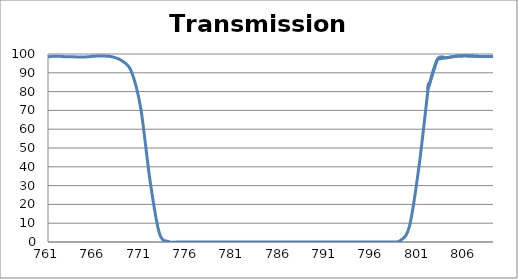
| Category | Transmission (%) |
|---|---|
| 2600.0 | 65.392 |
| 2599.0 | 65.569 |
| 2598.0 | 65.712 |
| 2597.0 | 65.833 |
| 2596.0 | 65.933 |
| 2595.0 | 66.007 |
| 2594.0 | 66.052 |
| 2593.0 | 66.114 |
| 2592.0 | 66.077 |
| 2591.0 | 66.056 |
| 2590.0 | 66.05 |
| 2589.0 | 66.052 |
| 2588.0 | 66.001 |
| 2587.0 | 65.917 |
| 2586.0 | 65.876 |
| 2585.0 | 65.834 |
| 2584.0 | 65.83 |
| 2583.0 | 65.81 |
| 2582.0 | 65.764 |
| 2581.0 | 65.782 |
| 2580.0 | 65.828 |
| 2579.0 | 65.907 |
| 2578.0 | 66.003 |
| 2577.0 | 66.11 |
| 2576.0 | 66.23 |
| 2575.0 | 66.378 |
| 2574.0 | 66.574 |
| 2573.0 | 66.798 |
| 2572.0 | 67.039 |
| 2571.0 | 67.352 |
| 2570.0 | 67.721 |
| 2569.0 | 68.146 |
| 2568.0 | 68.59 |
| 2567.0 | 69.084 |
| 2566.0 | 69.505 |
| 2565.0 | 69.982 |
| 2564.0 | 70.445 |
| 2563.0 | 70.91 |
| 2562.0 | 71.297 |
| 2561.0 | 71.649 |
| 2560.0 | 71.98 |
| 2559.0 | 72.282 |
| 2558.0 | 72.572 |
| 2557.0 | 72.751 |
| 2556.0 | 72.898 |
| 2555.0 | 72.986 |
| 2554.0 | 73.059 |
| 2553.0 | 73.054 |
| 2552.0 | 72.981 |
| 2551.0 | 72.816 |
| 2550.0 | 72.572 |
| 2549.0 | 72.279 |
| 2548.0 | 71.984 |
| 2547.0 | 71.616 |
| 2546.0 | 71.232 |
| 2545.0 | 70.837 |
| 2544.0 | 70.409 |
| 2543.0 | 69.989 |
| 2542.0 | 69.563 |
| 2541.0 | 69.101 |
| 2540.0 | 68.692 |
| 2539.0 | 68.259 |
| 2538.0 | 67.835 |
| 2537.0 | 67.445 |
| 2536.0 | 67.096 |
| 2535.0 | 66.797 |
| 2534.0 | 66.562 |
| 2533.0 | 66.352 |
| 2532.0 | 66.209 |
| 2531.0 | 66.12 |
| 2530.0 | 66.064 |
| 2529.0 | 66.136 |
| 2528.0 | 66.3 |
| 2527.0 | 66.479 |
| 2526.0 | 66.714 |
| 2525.0 | 66.999 |
| 2524.0 | 67.356 |
| 2523.0 | 67.778 |
| 2522.0 | 68.26 |
| 2521.0 | 68.773 |
| 2520.0 | 69.35 |
| 2519.0 | 69.96 |
| 2518.0 | 70.579 |
| 2517.0 | 71.29 |
| 2516.0 | 71.95 |
| 2515.0 | 72.606 |
| 2514.0 | 73.218 |
| 2513.0 | 73.827 |
| 2512.0 | 74.378 |
| 2511.0 | 74.853 |
| 2510.0 | 75.248 |
| 2509.0 | 75.572 |
| 2508.0 | 75.848 |
| 2507.0 | 75.979 |
| 2506.0 | 76.055 |
| 2505.0 | 76.059 |
| 2504.0 | 75.941 |
| 2503.0 | 75.688 |
| 2502.0 | 75.381 |
| 2501.0 | 75.04 |
| 2500.0 | 74.624 |
| 2499.0 | 74.088 |
| 2498.0 | 73.537 |
| 2497.0 | 72.972 |
| 2496.0 | 72.404 |
| 2495.0 | 71.796 |
| 2494.0 | 71.179 |
| 2493.0 | 70.555 |
| 2492.0 | 69.954 |
| 2491.0 | 69.397 |
| 2490.0 | 68.921 |
| 2489.0 | 68.477 |
| 2488.0 | 68.054 |
| 2487.0 | 67.668 |
| 2486.0 | 67.337 |
| 2485.0 | 67.088 |
| 2484.0 | 66.941 |
| 2483.0 | 66.849 |
| 2482.0 | 66.819 |
| 2481.0 | 66.855 |
| 2480.0 | 66.971 |
| 2479.0 | 67.151 |
| 2478.0 | 67.407 |
| 2477.0 | 67.737 |
| 2476.0 | 68.134 |
| 2475.0 | 68.574 |
| 2474.0 | 69.086 |
| 2473.0 | 69.625 |
| 2472.0 | 70.196 |
| 2471.0 | 70.812 |
| 2470.0 | 71.411 |
| 2469.0 | 72.019 |
| 2468.0 | 72.648 |
| 2467.0 | 73.296 |
| 2466.0 | 73.874 |
| 2465.0 | 74.433 |
| 2464.0 | 74.97 |
| 2463.0 | 75.485 |
| 2462.0 | 75.889 |
| 2461.0 | 76.26 |
| 2460.0 | 76.544 |
| 2459.0 | 76.79 |
| 2458.0 | 77.011 |
| 2457.0 | 77.162 |
| 2456.0 | 77.234 |
| 2455.0 | 77.255 |
| 2454.0 | 77.234 |
| 2453.0 | 77.16 |
| 2452.0 | 77.054 |
| 2451.0 | 76.942 |
| 2450.0 | 76.807 |
| 2449.0 | 76.628 |
| 2448.0 | 76.45 |
| 2447.0 | 76.275 |
| 2446.0 | 76.106 |
| 2445.0 | 75.931 |
| 2444.0 | 75.772 |
| 2443.0 | 75.622 |
| 2442.0 | 75.512 |
| 2441.0 | 75.399 |
| 2440.0 | 75.288 |
| 2439.0 | 75.223 |
| 2438.0 | 75.197 |
| 2437.0 | 75.196 |
| 2436.0 | 75.216 |
| 2435.0 | 75.24 |
| 2434.0 | 75.305 |
| 2433.0 | 75.419 |
| 2432.0 | 75.549 |
| 2431.0 | 75.673 |
| 2430.0 | 75.783 |
| 2429.0 | 75.884 |
| 2428.0 | 76.011 |
| 2427.0 | 76.131 |
| 2426.0 | 76.223 |
| 2425.0 | 76.307 |
| 2424.0 | 76.385 |
| 2423.0 | 76.463 |
| 2422.0 | 76.546 |
| 2421.0 | 76.616 |
| 2420.0 | 76.647 |
| 2419.0 | 76.647 |
| 2418.0 | 76.644 |
| 2417.0 | 76.643 |
| 2416.0 | 76.65 |
| 2415.0 | 76.65 |
| 2414.0 | 76.644 |
| 2413.0 | 76.627 |
| 2412.0 | 76.619 |
| 2411.0 | 76.622 |
| 2410.0 | 76.607 |
| 2409.0 | 76.602 |
| 2408.0 | 76.606 |
| 2407.0 | 76.613 |
| 2406.0 | 76.616 |
| 2405.0 | 76.615 |
| 2404.0 | 76.611 |
| 2403.0 | 76.58 |
| 2402.0 | 76.531 |
| 2401.0 | 76.476 |
| 2400.0 | 76.444 |
| 2399.0 | 76.409 |
| 2398.0 | 76.325 |
| 2397.0 | 76.189 |
| 2396.0 | 76.01 |
| 2395.0 | 75.796 |
| 2394.0 | 75.561 |
| 2393.0 | 75.313 |
| 2392.0 | 74.987 |
| 2391.0 | 74.599 |
| 2390.0 | 74.17 |
| 2389.0 | 73.706 |
| 2388.0 | 73.204 |
| 2387.0 | 72.679 |
| 2386.0 | 72.137 |
| 2385.0 | 71.579 |
| 2384.0 | 71.007 |
| 2383.0 | 70.424 |
| 2382.0 | 69.843 |
| 2381.0 | 69.275 |
| 2380.0 | 68.702 |
| 2379.0 | 68.167 |
| 2378.0 | 67.665 |
| 2377.0 | 67.224 |
| 2376.0 | 66.84 |
| 2375.0 | 66.502 |
| 2374.0 | 66.164 |
| 2373.0 | 65.874 |
| 2372.0 | 65.662 |
| 2371.0 | 65.535 |
| 2370.0 | 65.459 |
| 2369.0 | 65.438 |
| 2368.0 | 65.477 |
| 2367.0 | 65.561 |
| 2366.0 | 65.687 |
| 2365.0 | 65.869 |
| 2364.0 | 66.115 |
| 2363.0 | 66.384 |
| 2362.0 | 66.668 |
| 2361.0 | 66.985 |
| 2360.0 | 67.341 |
| 2359.0 | 67.702 |
| 2358.0 | 68.036 |
| 2357.0 | 68.313 |
| 2356.0 | 68.567 |
| 2355.0 | 68.815 |
| 2354.0 | 69.021 |
| 2353.0 | 69.188 |
| 2352.0 | 69.291 |
| 2351.0 | 69.297 |
| 2350.0 | 69.217 |
| 2349.0 | 69.112 |
| 2348.0 | 68.929 |
| 2347.0 | 68.699 |
| 2346.0 | 68.378 |
| 2345.0 | 68.01 |
| 2344.0 | 67.616 |
| 2343.0 | 67.184 |
| 2342.0 | 66.73 |
| 2341.0 | 66.258 |
| 2340.0 | 65.758 |
| 2339.0 | 65.282 |
| 2338.0 | 64.845 |
| 2337.0 | 64.443 |
| 2336.0 | 64.053 |
| 2335.0 | 63.687 |
| 2334.0 | 63.375 |
| 2333.0 | 63.109 |
| 2332.0 | 62.893 |
| 2331.0 | 62.749 |
| 2330.0 | 62.664 |
| 2329.0 | 62.631 |
| 2328.0 | 62.658 |
| 2327.0 | 62.703 |
| 2326.0 | 62.792 |
| 2325.0 | 62.936 |
| 2324.0 | 63.129 |
| 2323.0 | 63.364 |
| 2322.0 | 63.613 |
| 2321.0 | 63.92 |
| 2320.0 | 64.245 |
| 2319.0 | 64.555 |
| 2318.0 | 64.844 |
| 2317.0 | 65.141 |
| 2316.0 | 65.392 |
| 2315.0 | 65.642 |
| 2314.0 | 65.861 |
| 2313.0 | 66.066 |
| 2312.0 | 66.227 |
| 2311.0 | 66.312 |
| 2310.0 | 66.341 |
| 2309.0 | 66.341 |
| 2308.0 | 66.301 |
| 2307.0 | 66.231 |
| 2306.0 | 66.153 |
| 2305.0 | 66.035 |
| 2304.0 | 65.872 |
| 2303.0 | 65.712 |
| 2302.0 | 65.555 |
| 2301.0 | 65.421 |
| 2300.0 | 65.268 |
| 2299.0 | 65.144 |
| 2298.0 | 65.053 |
| 2297.0 | 64.975 |
| 2296.0 | 64.936 |
| 2295.0 | 64.87 |
| 2294.0 | 64.835 |
| 2293.0 | 64.83 |
| 2292.0 | 64.857 |
| 2291.0 | 64.901 |
| 2290.0 | 64.963 |
| 2289.0 | 65.046 |
| 2288.0 | 65.121 |
| 2287.0 | 65.16 |
| 2286.0 | 65.197 |
| 2285.0 | 65.22 |
| 2284.0 | 65.219 |
| 2283.0 | 65.169 |
| 2282.0 | 65.091 |
| 2281.0 | 64.98 |
| 2280.0 | 64.812 |
| 2279.0 | 64.631 |
| 2278.0 | 64.383 |
| 2277.0 | 64.058 |
| 2276.0 | 63.702 |
| 2275.0 | 63.325 |
| 2274.0 | 62.902 |
| 2273.0 | 62.465 |
| 2272.0 | 62.015 |
| 2271.0 | 61.587 |
| 2270.0 | 61.133 |
| 2269.0 | 60.74 |
| 2268.0 | 60.393 |
| 2267.0 | 60.045 |
| 2266.0 | 59.742 |
| 2265.0 | 59.493 |
| 2264.0 | 59.269 |
| 2263.0 | 59.108 |
| 2262.0 | 59.016 |
| 2261.0 | 58.966 |
| 2260.0 | 58.954 |
| 2259.0 | 58.952 |
| 2258.0 | 59.022 |
| 2257.0 | 59.155 |
| 2256.0 | 59.275 |
| 2255.0 | 59.371 |
| 2254.0 | 59.445 |
| 2253.0 | 59.472 |
| 2252.0 | 59.451 |
| 2251.0 | 59.435 |
| 2250.0 | 59.334 |
| 2249.0 | 59.173 |
| 2248.0 | 58.926 |
| 2247.0 | 58.584 |
| 2246.0 | 58.147 |
| 2245.0 | 57.635 |
| 2244.0 | 57.051 |
| 2243.0 | 56.355 |
| 2242.0 | 55.578 |
| 2241.0 | 54.774 |
| 2240.0 | 53.89 |
| 2239.0 | 53.035 |
| 2238.0 | 52.113 |
| 2237.0 | 51.259 |
| 2236.0 | 50.404 |
| 2235.0 | 49.577 |
| 2234.0 | 48.798 |
| 2233.0 | 48.076 |
| 2232.0 | 47.42 |
| 2231.0 | 46.856 |
| 2230.0 | 46.356 |
| 2229.0 | 45.979 |
| 2228.0 | 45.703 |
| 2227.0 | 45.499 |
| 2226.0 | 45.386 |
| 2225.0 | 45.328 |
| 2224.0 | 45.396 |
| 2223.0 | 45.529 |
| 2222.0 | 45.768 |
| 2221.0 | 46.08 |
| 2220.0 | 46.447 |
| 2219.0 | 46.852 |
| 2218.0 | 47.315 |
| 2217.0 | 47.786 |
| 2216.0 | 48.29 |
| 2215.0 | 48.755 |
| 2214.0 | 49.233 |
| 2213.0 | 49.713 |
| 2212.0 | 50.107 |
| 2211.0 | 50.447 |
| 2210.0 | 50.719 |
| 2209.0 | 50.936 |
| 2208.0 | 51.076 |
| 2207.0 | 51.149 |
| 2206.0 | 51.204 |
| 2205.0 | 51.189 |
| 2204.0 | 51.124 |
| 2203.0 | 50.978 |
| 2202.0 | 50.783 |
| 2201.0 | 50.603 |
| 2200.0 | 50.431 |
| 2199.0 | 50.266 |
| 2198.0 | 50.106 |
| 2197.0 | 49.983 |
| 2196.0 | 49.88 |
| 2195.0 | 49.856 |
| 2194.0 | 49.85 |
| 2193.0 | 49.902 |
| 2192.0 | 49.999 |
| 2191.0 | 50.164 |
| 2190.0 | 50.431 |
| 2189.0 | 50.716 |
| 2188.0 | 51.083 |
| 2187.0 | 51.518 |
| 2186.0 | 51.992 |
| 2185.0 | 52.482 |
| 2184.0 | 53.045 |
| 2183.0 | 53.653 |
| 2182.0 | 54.217 |
| 2181.0 | 54.83 |
| 2180.0 | 55.368 |
| 2179.0 | 55.875 |
| 2178.0 | 56.347 |
| 2177.0 | 56.821 |
| 2176.0 | 57.155 |
| 2175.0 | 57.429 |
| 2174.0 | 57.618 |
| 2173.0 | 57.769 |
| 2172.0 | 57.888 |
| 2171.0 | 57.874 |
| 2170.0 | 57.807 |
| 2169.0 | 57.692 |
| 2168.0 | 57.545 |
| 2167.0 | 57.423 |
| 2166.0 | 57.256 |
| 2165.0 | 57.059 |
| 2164.0 | 56.901 |
| 2163.0 | 56.741 |
| 2162.0 | 56.638 |
| 2161.0 | 56.617 |
| 2160.0 | 56.62 |
| 2159.0 | 56.644 |
| 2158.0 | 56.736 |
| 2157.0 | 56.884 |
| 2156.0 | 57.14 |
| 2155.0 | 57.394 |
| 2154.0 | 57.67 |
| 2153.0 | 57.951 |
| 2152.0 | 58.289 |
| 2151.0 | 58.65 |
| 2150.0 | 58.939 |
| 2149.0 | 59.199 |
| 2148.0 | 59.406 |
| 2147.0 | 59.558 |
| 2146.0 | 59.686 |
| 2145.0 | 59.691 |
| 2144.0 | 59.682 |
| 2143.0 | 59.561 |
| 2142.0 | 59.381 |
| 2141.0 | 59.184 |
| 2140.0 | 58.93 |
| 2139.0 | 58.604 |
| 2138.0 | 58.248 |
| 2137.0 | 57.942 |
| 2136.0 | 57.637 |
| 2135.0 | 57.33 |
| 2134.0 | 57.076 |
| 2133.0 | 56.878 |
| 2132.0 | 56.725 |
| 2131.0 | 56.59 |
| 2130.0 | 56.507 |
| 2129.0 | 56.526 |
| 2128.0 | 56.609 |
| 2127.0 | 56.734 |
| 2126.0 | 56.876 |
| 2125.0 | 57.061 |
| 2124.0 | 57.294 |
| 2123.0 | 57.535 |
| 2122.0 | 57.726 |
| 2121.0 | 57.886 |
| 2120.0 | 58.003 |
| 2119.0 | 58.038 |
| 2118.0 | 57.981 |
| 2117.0 | 57.804 |
| 2116.0 | 57.503 |
| 2115.0 | 57.111 |
| 2114.0 | 56.593 |
| 2113.0 | 55.988 |
| 2112.0 | 55.234 |
| 2111.0 | 54.438 |
| 2110.0 | 53.562 |
| 2109.0 | 52.667 |
| 2108.0 | 51.734 |
| 2107.0 | 50.841 |
| 2106.0 | 49.953 |
| 2105.0 | 49.168 |
| 2104.0 | 48.407 |
| 2103.0 | 47.741 |
| 2102.0 | 47.183 |
| 2101.0 | 46.738 |
| 2100.0 | 46.382 |
| 2099.0 | 46.129 |
| 2098.0 | 45.999 |
| 2097.0 | 45.979 |
| 2096.0 | 46.036 |
| 2095.0 | 46.167 |
| 2094.0 | 46.39 |
| 2093.0 | 46.671 |
| 2092.0 | 47.017 |
| 2091.0 | 47.417 |
| 2090.0 | 47.808 |
| 2089.0 | 48.195 |
| 2088.0 | 48.561 |
| 2087.0 | 48.913 |
| 2086.0 | 49.168 |
| 2085.0 | 49.332 |
| 2084.0 | 49.405 |
| 2083.0 | 49.385 |
| 2082.0 | 49.257 |
| 2081.0 | 49.034 |
| 2080.0 | 48.679 |
| 2079.0 | 48.213 |
| 2078.0 | 47.654 |
| 2077.0 | 47.046 |
| 2076.0 | 46.442 |
| 2075.0 | 45.805 |
| 2074.0 | 45.115 |
| 2073.0 | 44.457 |
| 2072.0 | 43.848 |
| 2071.0 | 43.308 |
| 2070.0 | 42.828 |
| 2069.0 | 42.4 |
| 2068.0 | 42.047 |
| 2067.0 | 41.775 |
| 2066.0 | 41.597 |
| 2065.0 | 41.481 |
| 2064.0 | 41.404 |
| 2063.0 | 41.387 |
| 2062.0 | 41.444 |
| 2061.0 | 41.556 |
| 2060.0 | 41.667 |
| 2059.0 | 41.789 |
| 2058.0 | 41.915 |
| 2057.0 | 42.056 |
| 2056.0 | 42.206 |
| 2055.0 | 42.303 |
| 2054.0 | 42.35 |
| 2053.0 | 42.37 |
| 2052.0 | 42.362 |
| 2051.0 | 42.343 |
| 2050.0 | 42.303 |
| 2049.0 | 42.216 |
| 2048.0 | 42.107 |
| 2047.0 | 42.011 |
| 2046.0 | 41.938 |
| 2045.0 | 41.856 |
| 2044.0 | 41.787 |
| 2043.0 | 41.754 |
| 2042.0 | 41.794 |
| 2041.0 | 41.888 |
| 2040.0 | 42.018 |
| 2039.0 | 42.209 |
| 2038.0 | 42.465 |
| 2037.0 | 42.816 |
| 2036.0 | 43.213 |
| 2035.0 | 43.634 |
| 2034.0 | 44.086 |
| 2033.0 | 44.561 |
| 2032.0 | 45.092 |
| 2031.0 | 45.608 |
| 2030.0 | 46.072 |
| 2029.0 | 46.509 |
| 2028.0 | 46.88 |
| 2027.0 | 47.142 |
| 2026.0 | 47.312 |
| 2025.0 | 47.403 |
| 2024.0 | 47.418 |
| 2023.0 | 47.343 |
| 2022.0 | 47.169 |
| 2021.0 | 46.926 |
| 2020.0 | 46.644 |
| 2019.0 | 46.35 |
| 2018.0 | 46.05 |
| 2017.0 | 45.751 |
| 2016.0 | 45.477 |
| 2015.0 | 45.267 |
| 2014.0 | 45.143 |
| 2013.0 | 45.07 |
| 2012.0 | 45.057 |
| 2011.0 | 45.161 |
| 2010.0 | 45.36 |
| 2009.0 | 45.627 |
| 2008.0 | 45.971 |
| 2007.0 | 46.398 |
| 2006.0 | 46.908 |
| 2005.0 | 47.502 |
| 2004.0 | 48.126 |
| 2003.0 | 48.756 |
| 2002.0 | 49.373 |
| 2001.0 | 49.956 |
| 2000.0 | 50.493 |
| 1999.0 | 50.958 |
| 1998.0 | 51.348 |
| 1997.0 | 51.611 |
| 1996.0 | 51.704 |
| 1995.0 | 51.689 |
| 1994.0 | 51.563 |
| 1993.0 | 51.325 |
| 1992.0 | 51.027 |
| 1991.0 | 50.681 |
| 1990.0 | 50.28 |
| 1989.0 | 49.865 |
| 1988.0 | 49.491 |
| 1987.0 | 49.151 |
| 1986.0 | 48.878 |
| 1985.0 | 48.69 |
| 1984.0 | 48.59 |
| 1983.0 | 48.575 |
| 1982.0 | 48.665 |
| 1981.0 | 48.863 |
| 1980.0 | 49.138 |
| 1979.0 | 49.478 |
| 1978.0 | 49.879 |
| 1977.0 | 50.319 |
| 1976.0 | 50.777 |
| 1975.0 | 51.241 |
| 1974.0 | 51.651 |
| 1973.0 | 52.009 |
| 1972.0 | 52.297 |
| 1971.0 | 52.479 |
| 1970.0 | 52.549 |
| 1969.0 | 52.524 |
| 1968.0 | 52.401 |
| 1967.0 | 52.131 |
| 1966.0 | 51.786 |
| 1965.0 | 51.393 |
| 1964.0 | 50.915 |
| 1963.0 | 50.426 |
| 1962.0 | 49.946 |
| 1961.0 | 49.439 |
| 1960.0 | 49.002 |
| 1959.0 | 48.641 |
| 1958.0 | 48.327 |
| 1957.0 | 48.072 |
| 1956.0 | 47.949 |
| 1955.0 | 47.919 |
| 1954.0 | 47.967 |
| 1953.0 | 48.069 |
| 1952.0 | 48.215 |
| 1951.0 | 48.44 |
| 1950.0 | 48.717 |
| 1949.0 | 49.013 |
| 1948.0 | 49.288 |
| 1947.0 | 49.483 |
| 1946.0 | 49.63 |
| 1945.0 | 49.702 |
| 1944.0 | 49.716 |
| 1943.0 | 49.674 |
| 1942.0 | 49.539 |
| 1941.0 | 49.295 |
| 1940.0 | 48.973 |
| 1939.0 | 48.599 |
| 1938.0 | 48.197 |
| 1937.0 | 47.804 |
| 1936.0 | 47.465 |
| 1935.0 | 47.104 |
| 1934.0 | 46.808 |
| 1933.0 | 46.572 |
| 1932.0 | 46.392 |
| 1931.0 | 46.303 |
| 1930.0 | 46.276 |
| 1929.0 | 46.337 |
| 1928.0 | 46.477 |
| 1927.0 | 46.686 |
| 1926.0 | 46.993 |
| 1925.0 | 47.381 |
| 1924.0 | 47.795 |
| 1923.0 | 48.266 |
| 1922.0 | 48.752 |
| 1921.0 | 49.211 |
| 1920.0 | 49.618 |
| 1919.0 | 49.984 |
| 1918.0 | 50.363 |
| 1917.0 | 50.702 |
| 1916.0 | 50.992 |
| 1915.0 | 51.16 |
| 1914.0 | 51.274 |
| 1913.0 | 51.291 |
| 1912.0 | 51.288 |
| 1911.0 | 51.223 |
| 1910.0 | 51.207 |
| 1909.0 | 51.257 |
| 1908.0 | 51.348 |
| 1907.0 | 51.427 |
| 1906.0 | 51.443 |
| 1905.0 | 51.495 |
| 1904.0 | 51.609 |
| 1903.0 | 51.796 |
| 1902.0 | 52.056 |
| 1901.0 | 52.348 |
| 1900.0 | 52.662 |
| 1899.0 | 52.96 |
| 1898.0 | 53.188 |
| 1897.0 | 53.477 |
| 1896.0 | 53.708 |
| 1895.0 | 53.908 |
| 1894.0 | 54.059 |
| 1893.0 | 54.178 |
| 1892.0 | 54.149 |
| 1891.0 | 54.033 |
| 1890.0 | 53.932 |
| 1889.0 | 53.794 |
| 1888.0 | 53.716 |
| 1887.0 | 53.661 |
| 1886.0 | 53.568 |
| 1885.0 | 53.449 |
| 1884.0 | 53.37 |
| 1883.0 | 53.36 |
| 1882.0 | 53.325 |
| 1881.0 | 53.362 |
| 1880.0 | 53.483 |
| 1879.0 | 53.666 |
| 1878.0 | 53.864 |
| 1877.0 | 54.047 |
| 1876.0 | 54.176 |
| 1875.0 | 54.271 |
| 1874.0 | 54.36 |
| 1873.0 | 54.333 |
| 1872.0 | 54.259 |
| 1871.0 | 54.116 |
| 1870.0 | 53.955 |
| 1869.0 | 53.635 |
| 1868.0 | 53.331 |
| 1867.0 | 53.051 |
| 1866.0 | 52.75 |
| 1865.0 | 52.447 |
| 1864.0 | 52.186 |
| 1863.0 | 51.946 |
| 1862.0 | 51.728 |
| 1861.0 | 51.508 |
| 1860.0 | 51.239 |
| 1859.0 | 51.073 |
| 1858.0 | 51.042 |
| 1857.0 | 51.123 |
| 1856.0 | 51.304 |
| 1855.0 | 51.524 |
| 1854.0 | 51.765 |
| 1853.0 | 51.942 |
| 1852.0 | 52.169 |
| 1851.0 | 52.398 |
| 1850.0 | 52.683 |
| 1849.0 | 52.849 |
| 1848.0 | 52.923 |
| 1847.0 | 52.741 |
| 1846.0 | 52.537 |
| 1845.0 | 52.405 |
| 1844.0 | 52.354 |
| 1843.0 | 52.298 |
| 1842.0 | 52.101 |
| 1841.0 | 51.688 |
| 1840.0 | 51.252 |
| 1839.0 | 50.874 |
| 1838.0 | 50.665 |
| 1837.0 | 50.575 |
| 1836.0 | 50.537 |
| 1835.0 | 50.561 |
| 1834.0 | 50.714 |
| 1833.0 | 50.99 |
| 1832.0 | 51.365 |
| 1831.0 | 51.829 |
| 1830.0 | 52.272 |
| 1829.0 | 52.716 |
| 1828.0 | 53.228 |
| 1827.0 | 53.833 |
| 1826.0 | 54.394 |
| 1825.0 | 54.982 |
| 1824.0 | 55.434 |
| 1823.0 | 55.891 |
| 1822.0 | 56.237 |
| 1821.0 | 56.553 |
| 1820.0 | 56.712 |
| 1819.0 | 56.834 |
| 1818.0 | 56.906 |
| 1817.0 | 57.101 |
| 1816.0 | 57.234 |
| 1815.0 | 57.312 |
| 1814.0 | 57.339 |
| 1813.0 | 57.37 |
| 1812.0 | 57.407 |
| 1811.0 | 57.443 |
| 1810.0 | 57.498 |
| 1809.0 | 57.573 |
| 1808.0 | 57.657 |
| 1807.0 | 57.758 |
| 1806.0 | 57.813 |
| 1805.0 | 57.841 |
| 1804.0 | 57.823 |
| 1803.0 | 57.809 |
| 1802.0 | 57.759 |
| 1801.0 | 57.762 |
| 1800.0 | 57.725 |
| 1799.0 | 57.668 |
| 1798.0 | 57.592 |
| 1797.0 | 57.602 |
| 1796.0 | 57.661 |
| 1795.0 | 57.737 |
| 1794.0 | 57.802 |
| 1793.0 | 57.927 |
| 1792.0 | 58.074 |
| 1791.0 | 58.223 |
| 1790.0 | 58.396 |
| 1789.0 | 58.536 |
| 1788.0 | 58.646 |
| 1787.0 | 58.727 |
| 1786.0 | 58.729 |
| 1785.0 | 58.601 |
| 1784.0 | 58.422 |
| 1783.0 | 58.16 |
| 1782.0 | 57.835 |
| 1781.0 | 57.436 |
| 1780.0 | 56.981 |
| 1779.0 | 56.52 |
| 1778.0 | 56.041 |
| 1777.0 | 55.661 |
| 1776.0 | 55.321 |
| 1775.0 | 55.029 |
| 1774.0 | 54.838 |
| 1773.0 | 54.724 |
| 1772.0 | 54.696 |
| 1771.0 | 54.752 |
| 1770.0 | 54.885 |
| 1769.0 | 55.056 |
| 1768.0 | 55.274 |
| 1767.0 | 55.485 |
| 1766.0 | 55.667 |
| 1765.0 | 55.775 |
| 1764.0 | 55.819 |
| 1763.0 | 55.75 |
| 1762.0 | 55.552 |
| 1761.0 | 55.254 |
| 1760.0 | 54.848 |
| 1759.0 | 54.372 |
| 1758.0 | 53.871 |
| 1757.0 | 53.321 |
| 1756.0 | 52.809 |
| 1755.0 | 52.319 |
| 1754.0 | 51.928 |
| 1753.0 | 51.65 |
| 1752.0 | 51.498 |
| 1751.0 | 51.479 |
| 1750.0 | 51.577 |
| 1749.0 | 51.813 |
| 1748.0 | 52.139 |
| 1747.0 | 52.582 |
| 1746.0 | 53.041 |
| 1745.0 | 53.533 |
| 1744.0 | 54.012 |
| 1743.0 | 54.452 |
| 1742.0 | 54.779 |
| 1741.0 | 55.031 |
| 1740.0 | 55.184 |
| 1739.0 | 55.248 |
| 1738.0 | 55.231 |
| 1737.0 | 55.183 |
| 1736.0 | 55.09 |
| 1735.0 | 55.034 |
| 1734.0 | 55.037 |
| 1733.0 | 55.107 |
| 1732.0 | 55.257 |
| 1731.0 | 55.516 |
| 1730.0 | 55.913 |
| 1729.0 | 56.437 |
| 1728.0 | 57.062 |
| 1727.0 | 57.797 |
| 1726.0 | 58.533 |
| 1725.0 | 59.296 |
| 1724.0 | 60.021 |
| 1723.0 | 60.7 |
| 1722.0 | 61.285 |
| 1721.0 | 61.718 |
| 1720.0 | 62.013 |
| 1719.0 | 62.18 |
| 1718.0 | 62.234 |
| 1717.0 | 62.225 |
| 1716.0 | 62.194 |
| 1715.0 | 62.178 |
| 1714.0 | 62.224 |
| 1713.0 | 62.408 |
| 1712.0 | 62.738 |
| 1711.0 | 63.189 |
| 1710.0 | 63.742 |
| 1709.0 | 64.393 |
| 1708.0 | 65.063 |
| 1707.0 | 65.718 |
| 1706.0 | 66.238 |
| 1705.0 | 66.58 |
| 1704.0 | 66.623 |
| 1703.0 | 66.351 |
| 1702.0 | 65.774 |
| 1701.0 | 64.908 |
| 1700.0 | 63.832 |
| 1699.0 | 62.592 |
| 1698.0 | 61.334 |
| 1697.0 | 60.065 |
| 1696.0 | 58.924 |
| 1695.0 | 57.982 |
| 1694.0 | 57.323 |
| 1693.0 | 56.963 |
| 1692.0 | 56.915 |
| 1691.0 | 57.177 |
| 1690.0 | 57.781 |
| 1689.0 | 58.682 |
| 1688.0 | 59.781 |
| 1687.0 | 61.005 |
| 1686.0 | 62.217 |
| 1685.0 | 63.331 |
| 1684.0 | 64.171 |
| 1683.0 | 64.63 |
| 1682.0 | 64.574 |
| 1681.0 | 63.98 |
| 1680.0 | 62.863 |
| 1679.0 | 61.287 |
| 1678.0 | 59.511 |
| 1677.0 | 57.648 |
| 1676.0 | 55.743 |
| 1675.0 | 53.985 |
| 1674.0 | 52.518 |
| 1673.0 | 51.375 |
| 1672.0 | 50.646 |
| 1671.0 | 50.289 |
| 1670.0 | 50.331 |
| 1669.0 | 50.728 |
| 1668.0 | 51.454 |
| 1667.0 | 52.437 |
| 1666.0 | 53.598 |
| 1665.0 | 54.861 |
| 1664.0 | 56.095 |
| 1663.0 | 57.203 |
| 1662.0 | 58.082 |
| 1661.0 | 58.699 |
| 1660.0 | 58.99 |
| 1659.0 | 58.961 |
| 1658.0 | 58.707 |
| 1657.0 | 58.308 |
| 1656.0 | 57.863 |
| 1655.0 | 57.49 |
| 1654.0 | 57.253 |
| 1653.0 | 57.225 |
| 1652.0 | 57.489 |
| 1651.0 | 58.115 |
| 1650.0 | 59.06 |
| 1649.0 | 60.26 |
| 1648.0 | 61.762 |
| 1647.0 | 63.509 |
| 1646.0 | 65.419 |
| 1645.0 | 67.4 |
| 1644.0 | 69.246 |
| 1643.0 | 70.868 |
| 1642.0 | 72.242 |
| 1641.0 | 73.217 |
| 1640.0 | 73.768 |
| 1639.0 | 73.999 |
| 1638.0 | 73.942 |
| 1637.0 | 73.727 |
| 1636.0 | 73.487 |
| 1635.0 | 73.337 |
| 1634.0 | 73.325 |
| 1633.0 | 73.475 |
| 1632.0 | 73.773 |
| 1631.0 | 74.176 |
| 1630.0 | 74.619 |
| 1629.0 | 74.966 |
| 1628.0 | 75.109 |
| 1627.0 | 74.948 |
| 1626.0 | 74.353 |
| 1625.0 | 73.293 |
| 1624.0 | 71.809 |
| 1623.0 | 69.972 |
| 1622.0 | 67.885 |
| 1621.0 | 65.711 |
| 1620.0 | 63.516 |
| 1619.0 | 61.347 |
| 1618.0 | 59.422 |
| 1617.0 | 57.732 |
| 1616.0 | 56.216 |
| 1615.0 | 54.897 |
| 1614.0 | 53.719 |
| 1613.0 | 52.701 |
| 1612.0 | 51.832 |
| 1611.0 | 51.054 |
| 1610.0 | 50.336 |
| 1609.0 | 49.664 |
| 1608.0 | 49.035 |
| 1607.0 | 48.475 |
| 1606.0 | 48.01 |
| 1605.0 | 47.678 |
| 1604.0 | 47.487 |
| 1603.0 | 47.457 |
| 1602.0 | 47.633 |
| 1601.0 | 48.011 |
| 1600.0 | 48.595 |
| 1599.0 | 49.347 |
| 1598.0 | 50.164 |
| 1597.0 | 50.93 |
| 1596.0 | 51.568 |
| 1595.0 | 51.928 |
| 1594.0 | 51.871 |
| 1593.0 | 51.364 |
| 1592.0 | 50.374 |
| 1591.0 | 49.029 |
| 1590.0 | 47.407 |
| 1589.0 | 45.714 |
| 1588.0 | 44.098 |
| 1587.0 | 42.684 |
| 1586.0 | 41.585 |
| 1585.0 | 40.896 |
| 1584.0 | 40.68 |
| 1583.0 | 40.961 |
| 1582.0 | 41.872 |
| 1581.0 | 43.265 |
| 1580.0 | 45.173 |
| 1579.0 | 47.534 |
| 1578.0 | 50.294 |
| 1577.0 | 53.21 |
| 1576.0 | 56.087 |
| 1575.0 | 58.504 |
| 1574.0 | 60.369 |
| 1573.0 | 61.286 |
| 1572.0 | 61.251 |
| 1571.0 | 60.442 |
| 1570.0 | 59.074 |
| 1569.0 | 57.429 |
| 1568.0 | 55.751 |
| 1567.0 | 54.486 |
| 1566.0 | 53.73 |
| 1565.0 | 53.609 |
| 1564.0 | 54.255 |
| 1563.0 | 55.741 |
| 1562.0 | 58.109 |
| 1561.0 | 61.225 |
| 1560.0 | 65.104 |
| 1559.0 | 69.454 |
| 1558.0 | 73.83 |
| 1557.0 | 77.761 |
| 1556.0 | 80.807 |
| 1555.0 | 82.421 |
| 1554.0 | 82.668 |
| 1553.0 | 81.852 |
| 1552.0 | 80.251 |
| 1551.0 | 78.454 |
| 1550.0 | 76.885 |
| 1549.0 | 75.963 |
| 1548.0 | 75.884 |
| 1547.0 | 76.623 |
| 1546.0 | 78.213 |
| 1545.0 | 80.428 |
| 1544.0 | 82.974 |
| 1543.0 | 85.308 |
| 1542.0 | 86.929 |
| 1541.0 | 87.444 |
| 1540.0 | 86.595 |
| 1539.0 | 84.428 |
| 1538.0 | 81.207 |
| 1537.0 | 77.707 |
| 1536.0 | 74.079 |
| 1535.0 | 70.866 |
| 1534.0 | 68.287 |
| 1533.0 | 66.563 |
| 1532.0 | 65.8 |
| 1531.0 | 66.022 |
| 1530.0 | 67.155 |
| 1529.0 | 68.866 |
| 1528.0 | 71.083 |
| 1527.0 | 73.302 |
| 1526.0 | 75.107 |
| 1525.0 | 75.979 |
| 1524.0 | 75.575 |
| 1523.0 | 73.838 |
| 1522.0 | 70.794 |
| 1521.0 | 67.237 |
| 1520.0 | 63.282 |
| 1519.0 | 59.871 |
| 1518.0 | 57.015 |
| 1517.0 | 54.965 |
| 1516.0 | 53.824 |
| 1515.0 | 53.702 |
| 1514.0 | 54.474 |
| 1513.0 | 56.019 |
| 1512.0 | 58.247 |
| 1511.0 | 60.838 |
| 1510.0 | 63.516 |
| 1509.0 | 65.83 |
| 1508.0 | 67.378 |
| 1507.0 | 67.92 |
| 1506.0 | 67.502 |
| 1505.0 | 66.335 |
| 1504.0 | 64.789 |
| 1503.0 | 63.356 |
| 1502.0 | 62.294 |
| 1501.0 | 62.041 |
| 1500.0 | 62.596 |
| 1499.0 | 64.093 |
| 1498.0 | 66.59 |
| 1497.0 | 69.968 |
| 1496.0 | 74.085 |
| 1495.0 | 78.265 |
| 1494.0 | 82.31 |
| 1493.0 | 85.311 |
| 1492.0 | 86.884 |
| 1491.0 | 86.694 |
| 1490.0 | 84.919 |
| 1489.0 | 82.222 |
| 1488.0 | 78.916 |
| 1487.0 | 76.187 |
| 1486.0 | 73.999 |
| 1485.0 | 72.665 |
| 1484.0 | 72.372 |
| 1483.0 | 73.071 |
| 1482.0 | 74.61 |
| 1481.0 | 76.551 |
| 1480.0 | 78.543 |
| 1479.0 | 79.852 |
| 1478.0 | 79.947 |
| 1477.0 | 78.697 |
| 1476.0 | 76.021 |
| 1475.0 | 72.621 |
| 1474.0 | 68.751 |
| 1473.0 | 65.324 |
| 1472.0 | 62.405 |
| 1471.0 | 60.345 |
| 1470.0 | 59.206 |
| 1469.0 | 59.022 |
| 1468.0 | 59.626 |
| 1467.0 | 60.801 |
| 1466.0 | 62.212 |
| 1465.0 | 63.449 |
| 1464.0 | 63.98 |
| 1463.0 | 63.658 |
| 1462.0 | 62.343 |
| 1461.0 | 60.219 |
| 1460.0 | 57.547 |
| 1459.0 | 54.67 |
| 1458.0 | 52.356 |
| 1457.0 | 50.414 |
| 1456.0 | 49.087 |
| 1455.0 | 48.523 |
| 1454.0 | 48.652 |
| 1453.0 | 49.489 |
| 1452.0 | 50.831 |
| 1451.0 | 52.611 |
| 1450.0 | 54.512 |
| 1449.0 | 56.073 |
| 1448.0 | 57.247 |
| 1447.0 | 57.756 |
| 1446.0 | 57.666 |
| 1445.0 | 56.946 |
| 1444.0 | 55.941 |
| 1443.0 | 55.013 |
| 1442.0 | 54.343 |
| 1441.0 | 54.333 |
| 1440.0 | 55.001 |
| 1439.0 | 56.441 |
| 1438.0 | 58.596 |
| 1437.0 | 61.364 |
| 1436.0 | 64.505 |
| 1435.0 | 67.485 |
| 1434.0 | 70.369 |
| 1433.0 | 72.306 |
| 1432.0 | 73.547 |
| 1431.0 | 74.097 |
| 1430.0 | 74.239 |
| 1429.0 | 74.398 |
| 1428.0 | 75.026 |
| 1427.0 | 76.125 |
| 1426.0 | 77.942 |
| 1425.0 | 80.173 |
| 1424.0 | 82.778 |
| 1423.0 | 85.058 |
| 1422.0 | 86.59 |
| 1421.0 | 86.931 |
| 1420.0 | 86.036 |
| 1419.0 | 84.08 |
| 1418.0 | 81.641 |
| 1417.0 | 79.535 |
| 1416.0 | 77.81 |
| 1415.0 | 77.086 |
| 1414.0 | 77.445 |
| 1413.0 | 78.802 |
| 1412.0 | 80.786 |
| 1411.0 | 82.945 |
| 1410.0 | 84.632 |
| 1409.0 | 84.799 |
| 1408.0 | 83.074 |
| 1407.0 | 79.249 |
| 1406.0 | 74.338 |
| 1405.0 | 68.593 |
| 1404.0 | 62.835 |
| 1403.0 | 58.22 |
| 1402.0 | 55.002 |
| 1401.0 | 53.191 |
| 1400.0 | 52.505 |
| 1399.0 | 52.727 |
| 1398.0 | 53.813 |
| 1397.0 | 55.303 |
| 1396.0 | 56.444 |
| 1395.0 | 56.342 |
| 1394.0 | 54.698 |
| 1393.0 | 51.941 |
| 1392.0 | 47.827 |
| 1391.0 | 43.782 |
| 1390.0 | 40.361 |
| 1389.0 | 37.76 |
| 1388.0 | 35.977 |
| 1387.0 | 35.091 |
| 1386.0 | 35.448 |
| 1385.0 | 37.005 |
| 1384.0 | 39.706 |
| 1383.0 | 43.695 |
| 1382.0 | 48.386 |
| 1381.0 | 52.935 |
| 1380.0 | 56.617 |
| 1379.0 | 58.831 |
| 1378.0 | 58.939 |
| 1377.0 | 57.271 |
| 1376.0 | 54.549 |
| 1375.0 | 51.753 |
| 1374.0 | 49.224 |
| 1373.0 | 47.759 |
| 1372.0 | 47.504 |
| 1371.0 | 48.655 |
| 1370.0 | 51.091 |
| 1369.0 | 54.72 |
| 1368.0 | 59.88 |
| 1367.0 | 66.127 |
| 1366.0 | 72.136 |
| 1365.0 | 77.698 |
| 1364.0 | 81.727 |
| 1363.0 | 83.477 |
| 1362.0 | 82.979 |
| 1361.0 | 81.201 |
| 1360.0 | 78.995 |
| 1359.0 | 77.178 |
| 1358.0 | 76.107 |
| 1357.0 | 75.751 |
| 1356.0 | 76.368 |
| 1355.0 | 77.55 |
| 1354.0 | 79.303 |
| 1353.0 | 81.316 |
| 1352.0 | 83.742 |
| 1351.0 | 86.241 |
| 1350.0 | 88.679 |
| 1349.0 | 90.595 |
| 1348.0 | 91.773 |
| 1347.0 | 91.49 |
| 1346.0 | 89.44 |
| 1345.0 | 85.455 |
| 1344.0 | 80.1 |
| 1343.0 | 74.247 |
| 1342.0 | 68.256 |
| 1341.0 | 63.234 |
| 1340.0 | 59.737 |
| 1339.0 | 57.66 |
| 1338.0 | 57.324 |
| 1337.0 | 58.728 |
| 1336.0 | 61.834 |
| 1335.0 | 66.132 |
| 1334.0 | 70.96 |
| 1333.0 | 74.775 |
| 1332.0 | 76.22 |
| 1331.0 | 74.144 |
| 1330.0 | 69.142 |
| 1329.0 | 62.588 |
| 1328.0 | 55.773 |
| 1327.0 | 50.071 |
| 1326.0 | 46.191 |
| 1325.0 | 44.275 |
| 1324.0 | 44.33 |
| 1323.0 | 46.492 |
| 1322.0 | 50.835 |
| 1321.0 | 57.179 |
| 1320.0 | 65 |
| 1319.0 | 72.463 |
| 1318.0 | 77.387 |
| 1317.0 | 77.781 |
| 1316.0 | 73.968 |
| 1315.0 | 67.833 |
| 1314.0 | 61.609 |
| 1313.0 | 57.31 |
| 1312.0 | 55.321 |
| 1311.0 | 56.037 |
| 1310.0 | 59.428 |
| 1309.0 | 65.516 |
| 1308.0 | 73.946 |
| 1307.0 | 83.047 |
| 1306.0 | 90.814 |
| 1305.0 | 94.765 |
| 1304.0 | 94.102 |
| 1303.0 | 90.094 |
| 1302.0 | 85.241 |
| 1301.0 | 81.499 |
| 1300.0 | 80.081 |
| 1299.0 | 81.503 |
| 1298.0 | 85.332 |
| 1297.0 | 90.34 |
| 1296.0 | 94.441 |
| 1295.0 | 95.125 |
| 1294.0 | 91.198 |
| 1293.0 | 83.48 |
| 1292.0 | 74.039 |
| 1291.0 | 65.027 |
| 1290.0 | 57.921 |
| 1289.0 | 53.497 |
| 1288.0 | 51.641 |
| 1287.0 | 52.439 |
| 1286.0 | 55.78 |
| 1285.0 | 61.454 |
| 1284.0 | 68.686 |
| 1283.0 | 75.41 |
| 1282.0 | 79.099 |
| 1281.0 | 78.284 |
| 1280.0 | 73.062 |
| 1279.0 | 65.678 |
| 1278.0 | 58.641 |
| 1277.0 | 53.31 |
| 1276.0 | 50.243 |
| 1275.0 | 49.635 |
| 1274.0 | 51.31 |
| 1273.0 | 55.175 |
| 1272.0 | 61.099 |
| 1271.0 | 68.483 |
| 1270.0 | 75.915 |
| 1269.0 | 81.907 |
| 1268.0 | 85.529 |
| 1267.0 | 86.509 |
| 1266.0 | 85.802 |
| 1265.0 | 84.644 |
| 1264.0 | 84.086 |
| 1263.0 | 84.756 |
| 1262.0 | 86.647 |
| 1261.0 | 89.366 |
| 1260.0 | 92.414 |
| 1259.0 | 95.098 |
| 1258.0 | 97.014 |
| 1257.0 | 98.15 |
| 1256.0 | 98.698 |
| 1255.0 | 98.94 |
| 1254.0 | 99.025 |
| 1253.0 | 98.81 |
| 1252.0 | 97.838 |
| 1251.0 | 95.585 |
| 1250.0 | 91.853 |
| 1249.0 | 86.731 |
| 1248.0 | 80.983 |
| 1247.0 | 75.617 |
| 1246.0 | 71.279 |
| 1245.0 | 68.561 |
| 1244.0 | 67.854 |
| 1243.0 | 69.358 |
| 1242.0 | 72.894 |
| 1241.0 | 78.059 |
| 1240.0 | 83.783 |
| 1239.0 | 88.31 |
| 1238.0 | 90.081 |
| 1237.0 | 88.462 |
| 1236.0 | 84.325 |
| 1235.0 | 79.04 |
| 1234.0 | 74.338 |
| 1233.0 | 71.34 |
| 1232.0 | 70.42 |
| 1231.0 | 71.775 |
| 1230.0 | 75.062 |
| 1229.0 | 79.895 |
| 1228.0 | 85.359 |
| 1227.0 | 90.349 |
| 1226.0 | 93.914 |
| 1225.0 | 95.429 |
| 1224.0 | 95.109 |
| 1223.0 | 93.707 |
| 1222.0 | 92.292 |
| 1221.0 | 91.391 |
| 1220.0 | 91.228 |
| 1219.0 | 91.739 |
| 1218.0 | 92.546 |
| 1217.0 | 93.411 |
| 1216.0 | 93.994 |
| 1215.0 | 94.203 |
| 1214.0 | 94.165 |
| 1213.0 | 94.106 |
| 1212.0 | 94.283 |
| 1211.0 | 94.853 |
| 1210.0 | 95.684 |
| 1209.0 | 96.546 |
| 1208.0 | 97.063 |
| 1207.0 | 96.924 |
| 1206.0 | 96.032 |
| 1205.0 | 94.541 |
| 1204.0 | 92.904 |
| 1203.0 | 91.542 |
| 1202.0 | 90.905 |
| 1201.0 | 91.276 |
| 1200.0 | 92.618 |
| 1199.0 | 94.607 |
| 1198.0 | 96.668 |
| 1197.0 | 98.113 |
| 1196.0 | 98.302 |
| 1195.0 | 97.116 |
| 1194.0 | 95.071 |
| 1193.0 | 92.749 |
| 1192.0 | 90.784 |
| 1191.0 | 89.703 |
| 1190.0 | 89.729 |
| 1189.0 | 90.906 |
| 1188.0 | 92.69 |
| 1187.0 | 94.593 |
| 1186.0 | 95.989 |
| 1185.0 | 96.363 |
| 1184.0 | 95.626 |
| 1183.0 | 94.049 |
| 1182.0 | 92.306 |
| 1181.0 | 90.935 |
| 1180.0 | 90.287 |
| 1179.0 | 90.594 |
| 1178.0 | 91.683 |
| 1177.0 | 93.24 |
| 1176.0 | 94.641 |
| 1175.0 | 95.412 |
| 1174.0 | 95.263 |
| 1173.0 | 94.275 |
| 1172.0 | 92.855 |
| 1171.0 | 91.574 |
| 1170.0 | 90.856 |
| 1169.0 | 90.995 |
| 1168.0 | 91.896 |
| 1167.0 | 93.323 |
| 1166.0 | 94.769 |
| 1165.0 | 95.684 |
| 1164.0 | 95.773 |
| 1163.0 | 95.069 |
| 1162.0 | 94.085 |
| 1161.0 | 93.28 |
| 1160.0 | 93.162 |
| 1159.0 | 93.84 |
| 1158.0 | 95.05 |
| 1157.0 | 96.341 |
| 1156.0 | 97.162 |
| 1155.0 | 97.166 |
| 1154.0 | 96.417 |
| 1153.0 | 95.29 |
| 1152.0 | 94.386 |
| 1151.0 | 94.254 |
| 1150.0 | 94.958 |
| 1149.0 | 96.286 |
| 1148.0 | 97.633 |
| 1147.0 | 98.34 |
| 1146.0 | 97.983 |
| 1145.0 | 96.629 |
| 1144.0 | 95.045 |
| 1143.0 | 93.667 |
| 1142.0 | 93.125 |
| 1141.0 | 93.655 |
| 1140.0 | 95.014 |
| 1139.0 | 96.599 |
| 1138.0 | 97.815 |
| 1137.0 | 98.202 |
| 1136.0 | 97.603 |
| 1135.0 | 96.412 |
| 1134.0 | 95.2 |
| 1133.0 | 94.551 |
| 1132.0 | 94.803 |
| 1131.0 | 95.824 |
| 1130.0 | 97.085 |
| 1129.0 | 98.112 |
| 1128.0 | 98.542 |
| 1127.0 | 98.195 |
| 1126.0 | 97.475 |
| 1125.0 | 96.753 |
| 1124.0 | 96.426 |
| 1123.0 | 96.602 |
| 1122.0 | 97.05 |
| 1121.0 | 97.294 |
| 1120.0 | 96.973 |
| 1119.0 | 96.068 |
| 1118.0 | 94.914 |
| 1117.0 | 94.071 |
| 1116.0 | 94.056 |
| 1115.0 | 95.032 |
| 1114.0 | 96.553 |
| 1113.0 | 97.954 |
| 1112.0 | 98.476 |
| 1111.0 | 97.735 |
| 1110.0 | 96.323 |
| 1109.0 | 94.714 |
| 1108.0 | 93.88 |
| 1107.0 | 94.207 |
| 1106.0 | 95.481 |
| 1105.0 | 97.121 |
| 1104.0 | 98.261 |
| 1103.0 | 98.273 |
| 1102.0 | 97.142 |
| 1101.0 | 95.444 |
| 1100.0 | 93.935 |
| 1099.0 | 93.505 |
| 1098.0 | 94.238 |
| 1097.0 | 95.894 |
| 1096.0 | 97.544 |
| 1095.0 | 98.453 |
| 1094.0 | 98.187 |
| 1093.0 | 96.975 |
| 1092.0 | 95.468 |
| 1091.0 | 94.661 |
| 1090.0 | 94.768 |
| 1089.0 | 95.876 |
| 1088.0 | 97.334 |
| 1087.0 | 98.351 |
| 1086.0 | 98.212 |
| 1085.0 | 96.627 |
| 1084.0 | 94.478 |
| 1083.0 | 92.461 |
| 1082.0 | 91.633 |
| 1081.0 | 92.277 |
| 1080.0 | 94.102 |
| 1079.0 | 96.303 |
| 1078.0 | 98.015 |
| 1077.0 | 98.473 |
| 1076.0 | 97.879 |
| 1075.0 | 96.613 |
| 1074.0 | 95.566 |
| 1073.0 | 95.182 |
| 1072.0 | 95.573 |
| 1071.0 | 96.51 |
| 1070.0 | 97.475 |
| 1069.0 | 98.112 |
| 1068.0 | 98.291 |
| 1067.0 | 98.226 |
| 1066.0 | 98.095 |
| 1065.0 | 98.158 |
| 1064.0 | 98.405 |
| 1063.0 | 98.817 |
| 1062.0 | 99.138 |
| 1061.0 | 99.306 |
| 1060.0 | 99.283 |
| 1059.0 | 99.207 |
| 1058.0 | 99.114 |
| 1057.0 | 99.1 |
| 1056.0 | 99.147 |
| 1055.0 | 99.187 |
| 1054.0 | 99.178 |
| 1053.0 | 99.196 |
| 1052.0 | 99.23 |
| 1051.0 | 99.274 |
| 1050.0 | 99.29 |
| 1049.0 | 99.36 |
| 1048.0 | 99.429 |
| 1047.0 | 99.473 |
| 1046.0 | 99.498 |
| 1045.0 | 99.492 |
| 1044.0 | 99.487 |
| 1043.0 | 99.395 |
| 1042.0 | 99.305 |
| 1041.0 | 99.227 |
| 1040.0 | 99.689 |
| 1039.0 | 99.102 |
| 1038.0 | 99.764 |
| 1037.0 | 92.119 |
| 1036.0 | 91.051 |
| 1035.0 | 99.359 |
| 1034.0 | 97.86 |
| 1033.0 | 98.214 |
| 1032.0 | 98.049 |
| 1031.0 | 97.091 |
| 1030.0 | 94.073 |
| 1029.0 | 93.319 |
| 1028.0 | 92.448 |
| 1027.0 | 99.98 |
| 1026.0 | 96.391 |
| 1025.0 | 98.216 |
| 1024.0 | 98.252 |
| 1023.0 | 94.961 |
| 1022.0 | 93.617 |
| 1021.0 | 94.542 |
| 1020.0 | 98.565 |
| 1019.0 | 97.943 |
| 1018.0 | 98.011 |
| 1017.0 | 98.234 |
| 1016.0 | 95.399 |
| 1015.0 | 95.069 |
| 1014.0 | 98.968 |
| 1013.0 | 98.172 |
| 1012.0 | 98.947 |
| 1011.0 | 99.037 |
| 1010.0 | 95.827 |
| 1009.0 | 94.544 |
| 1008.0 | 99.934 |
| 1007.0 | 98.821 |
| 1006.0 | 97.774 |
| 1005.0 | 97.467 |
| 1004.0 | 95.137 |
| 1003.0 | 94.945 |
| 1002.0 | 99.626 |
| 1001.0 | 98.73 |
| 1000.0 | 99.25 |
| 999.0 | 95.756 |
| 998.0 | 94.192 |
| 997.0 | 99.392 |
| 996.0 | 96.794 |
| 995.0 | 99.83 |
| 994.0 | 95.215 |
| 993.0 | 94.619 |
| 992.0 | 99.139 |
| 991.0 | 96.586 |
| 990.0 | 97.863 |
| 989.0 | 96.237 |
| 988.0 | 93.402 |
| 987.0 | 99.861 |
| 986.0 | 98.705 |
| 985.0 | 99.159 |
| 984.0 | 95.624 |
| 983.0 | 99.244 |
| 982.0 | 98.317 |
| 981.0 | 99.967 |
| 980.0 | 95.987 |
| 979.0 | 99.362 |
| 978.0 | 99.81 |
| 977.0 | 94.807 |
| 976.0 | 93.353 |
| 975.0 | 99.987 |
| 974.0 | 98.752 |
| 973.0 | 96.663 |
| 972.0 | 99.3 |
| 971.0 | 97.888 |
| 970.0 | 98.861 |
| 969.0 | 95.958 |
| 968.0 | 99.021 |
| 967.0 | 99.375 |
| 966.0 | 98.685 |
| 965.0 | 98.284 |
| 964.0 | 99.324 |
| 963.0 | 94.753 |
| 962.0 | 99.154 |
| 961.0 | 95.538 |
| 960.0 | 99.463 |
| 959.0 | 93.433 |
| 958.0 | 93.059 |
| 957.0 | 99.992 |
| 956.0 | 95.979 |
| 955.0 | 99.969 |
| 954.0 | 93.014 |
| 953.0 | 92.413 |
| 952.0 | 99.263 |
| 951.0 | 93.776 |
| 950.0 | 99.031 |
| 949.0 | 93.592 |
| 948.0 | 92.804 |
| 947.0 | 99.716 |
| 946.0 | 97.193 |
| 945.0 | 99.884 |
| 944.0 | 95.107 |
| 943.0 | 97.446 |
| 942.0 | 99.689 |
| 941.0 | 97.433 |
| 940.0 | 94.514 |
| 939.0 | 99.786 |
| 938.0 | 95.499 |
| 937.0 | 98.895 |
| 936.0 | 96.367 |
| 935.0 | 99.248 |
| 934.0 | 99.419 |
| 933.0 | 97.972 |
| 932.0 | 93.001 |
| 931.0 | 94.173 |
| 930.0 | 98.926 |
| 929.0 | 94.149 |
| 928.0 | 97.427 |
| 927.0 | 98.434 |
| 926.0 | 96.089 |
| 925.0 | 99.282 |
| 924.0 | 97.267 |
| 923.0 | 99.365 |
| 922.0 | 93.491 |
| 921.0 | 93.536 |
| 920.0 | 99.705 |
| 919.0 | 96.381 |
| 918.0 | 99.815 |
| 917.0 | 99.151 |
| 916.0 | 98.31 |
| 915.0 | 95.399 |
| 914.0 | 97.929 |
| 913.0 | 97.688 |
| 912.0 | 98.781 |
| 911.0 | 97.81 |
| 910.0 | 99.021 |
| 909.0 | 97.388 |
| 908.0 | 95.14 |
| 907.0 | 97.636 |
| 906.0 | 98.997 |
| 905.0 | 98.654 |
| 904.0 | 99.535 |
| 903.0 | 99.948 |
| 902.0 | 99.431 |
| 901.0 | 96.227 |
| 900.0 | 93.937 |
| 899.0 | 98.605 |
| 898.0 | 96.022 |
| 897.0 | 97.525 |
| 896.0 | 96.074 |
| 895.0 | 97.029 |
| 894.0 | 99.303 |
| 893.0 | 97.55 |
| 892.0 | 98.718 |
| 891.0 | 98.301 |
| 890.0 | 95.278 |
| 889.0 | 96.122 |
| 888.0 | 97.914 |
| 887.0 | 98.618 |
| 886.0 | 97.583 |
| 885.0 | 97.49 |
| 884.0 | 99.102 |
| 883.0 | 98.863 |
| 882.0 | 98.693 |
| 881.0 | 98.462 |
| 880.0 | 97.732 |
| 879.0 | 96.963 |
| 878.0 | 97.511 |
| 877.0 | 99.241 |
| 876.0 | 99.465 |
| 875.0 | 98.213 |
| 874.0 | 98.347 |
| 873.0 | 99.942 |
| 872.0 | 98.719 |
| 871.0 | 97.385 |
| 870.0 | 96.144 |
| 869.0 | 95.233 |
| 868.0 | 96.506 |
| 867.0 | 98.718 |
| 866.0 | 99.948 |
| 865.0 | 99.472 |
| 864.0 | 97.56 |
| 863.0 | 97.202 |
| 862.0 | 99.375 |
| 861.0 | 99.562 |
| 860.0 | 99.454 |
| 859.0 | 99.785 |
| 858.0 | 98.94 |
| 857.0 | 98.633 |
| 856.0 | 98.951 |
| 855.0 | 98.745 |
| 854.0 | 98.691 |
| 853.0 | 98.988 |
| 852.0 | 99.004 |
| 851.0 | 99.005 |
| 850.0 | 99.345 |
| 849.0 | 99.01 |
| 848.0 | 99.411 |
| 847.0 | 99.566 |
| 846.0 | 98.401 |
| 845.0 | 98.284 |
| 844.0 | 98.595 |
| 843.0 | 98.397 |
| 842.0 | 97.916 |
| 841.0 | 98.47 |
| 840.0 | 99.116 |
| 839.0 | 98.388 |
| 838.0 | 98.28 |
| 837.0 | 98.94 |
| 836.0 | 98.991 |
| 835.0 | 98.116 |
| 834.0 | 97.76 |
| 833.0 | 97.829 |
| 832.0 | 97.484 |
| 831.0 | 97.522 |
| 830.0 | 97.989 |
| 829.0 | 98.554 |
| 828.0 | 98.447 |
| 827.0 | 98.584 |
| 826.0 | 98.631 |
| 825.0 | 98.567 |
| 824.0 | 98.253 |
| 823.0 | 97.85 |
| 822.0 | 97.961 |
| 821.0 | 98.928 |
| 820.0 | 98.402 |
| 819.0 | 97.703 |
| 818.0 | 98.032 |
| 817.0 | 98.539 |
| 816.0 | 97.819 |
| 815.0 | 97.532 |
| 814.0 | 97.917 |
| 813.0 | 98.309 |
| 812.0 | 98.657 |
| 811.0 | 98.882 |
| 810.0 | 98.85 |
| 809.0 | 98.706 |
| 808.0 | 98.606 |
| 807.0 | 98.847 |
| 806.0 | 99.028 |
| 805.0 | 98.838 |
| 804.0 | 97.998 |
| 803.0 | 97.157 |
| 802.0 | 81.603 |
| 801.0 | 39.593 |
| 800.0 | 8.623 |
| 799.0 | 0.754 |
| 798.0 | 0.06 |
| 797.0 | 0.003 |
| 796.0 | 0.001 |
| 795.0 | 0 |
| 794.0 | 0 |
| 793.0 | 0 |
| 792.0 | 0 |
| 791.0 | 0 |
| 790.0 | 0 |
| 789.0 | 0 |
| 788.0 | 0 |
| 787.0 | 0 |
| 786.0 | 0 |
| 785.0 | 0 |
| 784.0 | 0 |
| 783.0 | 0 |
| 782.0 | 0 |
| 781.0 | 0 |
| 780.0 | 0 |
| 779.0 | 0 |
| 778.0 | 0 |
| 777.0 | 0 |
| 776.0 | 0.001 |
| 775.0 | 0.007 |
| 774.0 | 0.198 |
| 773.0 | 4.883 |
| 772.0 | 32.927 |
| 771.0 | 71.215 |
| 770.0 | 90.615 |
| 769.0 | 96.341 |
| 768.0 | 98.429 |
| 767.0 | 98.941 |
| 766.0 | 98.849 |
| 765.0 | 98.405 |
| 764.0 | 98.467 |
| 763.0 | 98.522 |
| 762.0 | 98.84 |
| 761.0 | 98.507 |
| 760.0 | 97.438 |
| 759.0 | 97.453 |
| 758.0 | 98.125 |
| 757.0 | 97.552 |
| 756.0 | 97.726 |
| 755.0 | 98.377 |
| 754.0 | 98.483 |
| 753.0 | 98.208 |
| 752.0 | 98.357 |
| 751.0 | 98.254 |
| 750.0 | 97.858 |
| 749.0 | 97.955 |
| 748.0 | 98.513 |
| 747.0 | 98.282 |
| 746.0 | 98.291 |
| 745.0 | 98.282 |
| 744.0 | 98.333 |
| 743.0 | 98.047 |
| 742.0 | 98.185 |
| 741.0 | 98.45 |
| 740.0 | 97.859 |
| 739.0 | 98.392 |
| 738.0 | 98.659 |
| 737.0 | 98.128 |
| 736.0 | 98.443 |
| 735.0 | 98.19 |
| 734.0 | 99.007 |
| 733.0 | 98.394 |
| 732.0 | 99.288 |
| 731.0 | 98.985 |
| 730.0 | 98.042 |
| 729.0 | 98.162 |
| 728.0 | 98.539 |
| 727.0 | 98.703 |
| 726.0 | 98.62 |
| 725.0 | 98.309 |
| 724.0 | 98.484 |
| 723.0 | 98.705 |
| 722.0 | 98.719 |
| 721.0 | 98.084 |
| 720.0 | 98.892 |
| 719.0 | 99.374 |
| 718.0 | 99.334 |
| 717.0 | 99.307 |
| 716.0 | 99.441 |
| 715.0 | 99.18 |
| 714.0 | 99.672 |
| 713.0 | 99.233 |
| 712.0 | 99.445 |
| 711.0 | 99.012 |
| 710.0 | 99.153 |
| 709.0 | 99.009 |
| 708.0 | 99.038 |
| 707.0 | 98.963 |
| 706.0 | 99.499 |
| 705.0 | 98.629 |
| 704.0 | 99.069 |
| 703.0 | 99.002 |
| 702.0 | 99.094 |
| 701.0 | 99.308 |
| 700.0 | 98.727 |
| 699.0 | 99.032 |
| 698.0 | 98.819 |
| 697.0 | 98.548 |
| 696.0 | 98.357 |
| 695.0 | 98.558 |
| 694.0 | 98.264 |
| 693.0 | 98.499 |
| 692.0 | 98.17 |
| 691.0 | 98.333 |
| 690.0 | 98.8 |
| 689.0 | 98.445 |
| 688.0 | 98.091 |
| 687.0 | 97.913 |
| 686.0 | 98.809 |
| 685.0 | 98.067 |
| 684.0 | 98.314 |
| 683.0 | 98.094 |
| 682.0 | 98.124 |
| 681.0 | 98.662 |
| 680.0 | 98.385 |
| 679.0 | 98.257 |
| 678.0 | 98.327 |
| 677.0 | 98.283 |
| 676.0 | 98.462 |
| 675.0 | 98.526 |
| 674.0 | 98.401 |
| 673.0 | 98.466 |
| 672.0 | 98.066 |
| 671.0 | 98.017 |
| 670.0 | 97.967 |
| 669.0 | 98.147 |
| 668.0 | 97.967 |
| 667.0 | 97.518 |
| 666.0 | 98.167 |
| 665.0 | 98.759 |
| 664.0 | 97.773 |
| 663.0 | 98.732 |
| 662.0 | 98.962 |
| 661.0 | 98.933 |
| 660.0 | 98.912 |
| 659.0 | 98.69 |
| 658.0 | 98.806 |
| 657.0 | 98.758 |
| 656.0 | 98.878 |
| 655.0 | 98.797 |
| 654.0 | 98.409 |
| 653.0 | 98.519 |
| 652.0 | 98.54 |
| 651.0 | 98.939 |
| 650.0 | 98.988 |
| 649.0 | 98.468 |
| 648.0 | 98.716 |
| 647.0 | 98.955 |
| 646.0 | 98.601 |
| 645.0 | 98.941 |
| 644.0 | 99.157 |
| 643.0 | 98.818 |
| 642.0 | 98.77 |
| 641.0 | 99.125 |
| 640.0 | 99.421 |
| 639.0 | 99.507 |
| 638.0 | 98.939 |
| 637.0 | 98.791 |
| 636.0 | 99.387 |
| 635.0 | 98.748 |
| 634.0 | 98.934 |
| 633.0 | 98.718 |
| 632.0 | 98.706 |
| 631.0 | 98.224 |
| 630.0 | 99.368 |
| 629.0 | 98.953 |
| 628.0 | 98.936 |
| 627.0 | 99.008 |
| 626.0 | 98.81 |
| 625.0 | 99.089 |
| 624.0 | 99.031 |
| 623.0 | 98.659 |
| 622.0 | 99.167 |
| 621.0 | 98.964 |
| 620.0 | 99.361 |
| 619.0 | 99.283 |
| 618.0 | 98.666 |
| 617.0 | 98.416 |
| 616.0 | 98.581 |
| 615.0 | 98.456 |
| 614.0 | 98.813 |
| 613.0 | 98.95 |
| 612.0 | 99.116 |
| 611.0 | 99.154 |
| 610.0 | 98.948 |
| 609.0 | 99.192 |
| 608.0 | 99.504 |
| 607.0 | 99.753 |
| 606.0 | 99.658 |
| 605.0 | 99.242 |
| 604.0 | 99.86 |
| 603.0 | 99.85 |
| 602.0 | 99.892 |
| 601.0 | 99.838 |
| 600.0 | 99.649 |
| 599.0 | 99.782 |
| 598.0 | 99.875 |
| 597.0 | 99.477 |
| 596.0 | 99.823 |
| 595.0 | 99.403 |
| 594.0 | 99.922 |
| 593.0 | 99.793 |
| 592.0 | 99.944 |
| 591.0 | 99.655 |
| 590.0 | 99.151 |
| 589.0 | 98.454 |
| 588.0 | 98.444 |
| 587.0 | 98.389 |
| 586.0 | 98.362 |
| 585.0 | 98.357 |
| 584.0 | 98.226 |
| 583.0 | 98.077 |
| 582.0 | 97.739 |
| 581.0 | 95.295 |
| 580.0 | 88.798 |
| 579.0 | 83.207 |
| 578.0 | 81.292 |
| 577.0 | 78.682 |
| 576.0 | 74.107 |
| 575.0 | 70.192 |
| 574.0 | 66.559 |
| 573.0 | 58.373 |
| 572.0 | 50.255 |
| 571.0 | 45.848 |
| 570.0 | 44.126 |
| 569.0 | 44.776 |
| 568.0 | 44.426 |
| 567.0 | 44.438 |
| 566.0 | 45.426 |
| 565.0 | 45.789 |
| 564.0 | 44.295 |
| 563.0 | 39.504 |
| 562.0 | 32.077 |
| 561.0 | 25.601 |
| 560.0 | 21.869 |
| 559.0 | 18.165 |
| 558.0 | 15.393 |
| 557.0 | 15.077 |
| 556.0 | 14.925 |
| 555.0 | 12.985 |
| 554.0 | 10.155 |
| 553.0 | 7.866 |
| 552.0 | 6.678 |
| 551.0 | 6.202 |
| 550.0 | 5.475 |
| 549.0 | 4.317 |
| 548.0 | 3.163 |
| 547.0 | 2.298 |
| 546.0 | 1.99 |
| 545.0 | 1.766 |
| 544.0 | 1.187 |
| 543.0 | 0.676 |
| 542.0 | 0.455 |
| 541.0 | 0.313 |
| 540.0 | 0.164 |
| 539.0 | 0.06 |
| 538.0 | 0.018 |
| 537.0 | 0.001 |
| 536.0 | 0.005 |
| 535.0 | 0.005 |
| 534.0 | 0.003 |
| 533.0 | 0.004 |
| 532.0 | 0.002 |
| 531.0 | 0.003 |
| 530.0 | 0.006 |
| 529.0 | 0.006 |
| 528.0 | 0.005 |
| 527.0 | 0.003 |
| 526.0 | 0.001 |
| 525.0 | 0.004 |
| 524.0 | 0.006 |
| 523.0 | 0.006 |
| 522.0 | 0.006 |
| 521.0 | 0.004 |
| 520.0 | 0.002 |
| 519.0 | 0.003 |
| 518.0 | 0.006 |
| 517.0 | 0.006 |
| 516.0 | 0.006 |
| 515.0 | 0.004 |
| 514.0 | 0.002 |
| 513.0 | 0.003 |
| 512.0 | 0.006 |
| 511.0 | 0.005 |
| 510.0 | 0.005 |
| 509.0 | 0.003 |
| 508.0 | 0.002 |
| 507.0 | 0.003 |
| 506.0 | 0.005 |
| 505.0 | 0.005 |
| 504.0 | 0.005 |
| 503.0 | 0.003 |
| 502.0 | 0.002 |
| 501.0 | 0.004 |
| 500.0 | 0.006 |
| 499.0 | 0.004 |
| 498.0 | 0.004 |
| 497.0 | 0.004 |
| 496.0 | 0.001 |
| 495.0 | 0.004 |
| 494.0 | 0.006 |
| 493.0 | 0.006 |
| 492.0 | 0.005 |
| 491.0 | 0.003 |
| 490.0 | 0.001 |
| 489.0 | 0.003 |
| 488.0 | 0.005 |
| 487.0 | 0.005 |
| 486.0 | 0.005 |
| 485.0 | 0.003 |
| 484.0 | 0.002 |
| 483.0 | 0.004 |
| 482.0 | 0.006 |
| 481.0 | 0.006 |
| 480.0 | 0.006 |
| 479.0 | 0.004 |
| 478.0 | 0.002 |
| 477.0 | 0.004 |
| 476.0 | 0.006 |
| 475.0 | 0.005 |
| 474.0 | 0.004 |
| 473.0 | 0.004 |
| 472.0 | 0.003 |
| 471.0 | 0.005 |
| 470.0 | 0.006 |
| 469.0 | 0.005 |
| 468.0 | 0.004 |
| 467.0 | 0.003 |
| 466.0 | 0.002 |
| 465.0 | 0.004 |
| 464.0 | 0.006 |
| 463.0 | 0.006 |
| 462.0 | 0.006 |
| 461.0 | 0.004 |
| 460.0 | 0.002 |
| 459.0 | 0.004 |
| 458.0 | 0.006 |
| 457.0 | 0.006 |
| 456.0 | 0.005 |
| 455.0 | 0.003 |
| 454.0 | 0.001 |
| 453.0 | 0.004 |
| 452.0 | 0.006 |
| 451.0 | 0.006 |
| 450.0 | 0.005 |
| 449.0 | 0.003 |
| 448.0 | 0.002 |
| 447.0 | 0.004 |
| 446.0 | 0.006 |
| 445.0 | 0.005 |
| 444.0 | 0.005 |
| 443.0 | 0.003 |
| 442.0 | 0.002 |
| 441.0 | 0.004 |
| 440.0 | 0.006 |
| 439.0 | 0.004 |
| 438.0 | 0.004 |
| 437.0 | 0.003 |
| 436.0 | 0.001 |
| 435.0 | 0.004 |
| 434.0 | 0.005 |
| 433.0 | 0.006 |
| 432.0 | 0.005 |
| 431.0 | 0.003 |
| 430.0 | 0.001 |
| 429.0 | 0.004 |
| 428.0 | 0.005 |
| 427.0 | 0.005 |
| 426.0 | 0.004 |
| 425.0 | 0.003 |
| 424.0 | 0.002 |
| 423.0 | 0.004 |
| 422.0 | 0.005 |
| 421.0 | 0.006 |
| 420.0 | 0.005 |
| 419.0 | 0.002 |
| 418.0 | 0.001 |
| 417.0 | 0.004 |
| 416.0 | 0.006 |
| 415.0 | 0.006 |
| 414.0 | 0.005 |
| 413.0 | 0.003 |
| 412.0 | 0.001 |
| 411.0 | 0.005 |
| 410.0 | 0.005 |
| 409.0 | 0.005 |
| 408.0 | 0.005 |
| 407.0 | 0.002 |
| 406.0 | 0.001 |
| 405.0 | 0.004 |
| 404.0 | 0.005 |
| 403.0 | 0.004 |
| 402.0 | 0.004 |
| 401.0 | 0.003 |
| 400.0 | 0.002 |
| 399.0 | 0.005 |
| 398.0 | 0.006 |
| 397.0 | 0.004 |
| 396.0 | 0.005 |
| 395.0 | 0.002 |
| 394.0 | 0.002 |
| 393.0 | 0.005 |
| 392.0 | 0.006 |
| 391.0 | 0.005 |
| 390.0 | 0.006 |
| 389.0 | 0.001 |
| 388.0 | 0.003 |
| 387.0 | 0.012 |
| 386.0 | 0.021 |
| 385.0 | 0.047 |
| 384.0 | 0.414 |
| 383.0 | 1.31 |
| 382.0 | 1.816 |
| 381.0 | 1.164 |
| 380.0 | 0.359 |
| 379.0 | 0.104 |
| 378.0 | 0.064 |
| 377.0 | 0.04 |
| 376.0 | 0.02 |
| 375.0 | 0.012 |
| 374.0 | 0.02 |
| 373.0 | 0.046 |
| 372.0 | 0.102 |
| 371.0 | 0.168 |
| 370.0 | 0.167 |
| 369.0 | 0.097 |
| 368.0 | 0.04 |
| 367.0 | 0.03 |
| 366.0 | 0.055 |
| 365.0 | 0.161 |
| 364.0 | 0.3 |
| 363.0 | 0.374 |
| 362.0 | 0.352 |
| 361.0 | 0.24 |
| 360.0 | 0.101 |
| 359.0 | 0.03 |
| 358.0 | 0.015 |
| 357.0 | 0.016 |
| 356.0 | 0.013 |
| 355.0 | 0.014 |
| 354.0 | 0.007 |
| 353.0 | 0.002 |
| 352.0 | 0.003 |
| 351.0 | 0.001 |
| 350.0 | 0.005 |
| 349.0 | 0.001 |
| 348.0 | 0.001 |
| 347.0 | 0.002 |
| 346.0 | 0.006 |
| 345.0 | 0.002 |
| 344.0 | 0.006 |
| 343.0 | 0.003 |
| 342.0 | 0.002 |
| 341.0 | 0.004 |
| 340.0 | 0.005 |
| 339.0 | 0.002 |
| 338.0 | 0.005 |
| 337.0 | 0.001 |
| 336.0 | 0.001 |
| 335.0 | 0.003 |
| 334.0 | 0.006 |
| 333.0 | 0.003 |
| 332.0 | 0.005 |
| 331.0 | 0.002 |
| 330.0 | 0.001 |
| 329.0 | 0.005 |
| 328.0 | 0.006 |
| 327.0 | 0.003 |
| 326.0 | 0.005 |
| 325.0 | 0.002 |
| 324.0 | 0.002 |
| 323.0 | 0.005 |
| 322.0 | 0.005 |
| 321.0 | 0.003 |
| 320.0 | 0.005 |
| 319.0 | 0.002 |
| 318.0 | 0.005 |
| 317.0 | 0.005 |
| 316.0 | 0.006 |
| 315.0 | 0.001 |
| 314.0 | 0.005 |
| 313.0 | 0.001 |
| 312.0 | 0.001 |
| 311.0 | 0.004 |
| 310.0 | 0.007 |
| 309.0 | 0.001 |
| 308.0 | 0.005 |
| 307.0 | 0.001 |
| 306.0 | 0.003 |
| 305.0 | 0.004 |
| 304.0 | 0.007 |
| 303.0 | 0.004 |
| 302.0 | 0.005 |
| 301.0 | 0 |
| 300.0 | 0.002 |
| 299.0 | 0.004 |
| 298.0 | 0.007 |
| 297.0 | 0.003 |
| 296.0 | 0.005 |
| 295.0 | 0 |
| 294.0 | 0.002 |
| 293.0 | 0.005 |
| 292.0 | 0.006 |
| 291.0 | 0.005 |
| 290.0 | 0.005 |
| 289.0 | 0 |
| 288.0 | 0.001 |
| 287.0 | 0.005 |
| 286.0 | 0.007 |
| 285.0 | 0.001 |
| 284.0 | 0.005 |
| 283.0 | 0.001 |
| 282.0 | 0.001 |
| 281.0 | 0.005 |
| 280.0 | 0.005 |
| 279.0 | 0.005 |
| 278.0 | 0.005 |
| 277.0 | 0.001 |
| 276.0 | 0.002 |
| 275.0 | 0.005 |
| 274.0 | 0.006 |
| 273.0 | 0.005 |
| 272.0 | 0.005 |
| 271.0 | 0.002 |
| 270.0 | 0.001 |
| 269.0 | 0.007 |
| 268.0 | 0.005 |
| 267.0 | 0.003 |
| 266.0 | 0.002 |
| 265.0 | 0.002 |
| 264.0 | 0.001 |
| 263.0 | 0.006 |
| 262.0 | 0.005 |
| 261.0 | 0.003 |
| 260.0 | 0.005 |
| 259.0 | 0.003 |
| 258.0 | 0.001 |
| 257.0 | 0.006 |
| 256.0 | 0.004 |
| 255.0 | 0.002 |
| 254.0 | 0.005 |
| 253.0 | 0.002 |
| 252.0 | 0.003 |
| 251.0 | 0.008 |
| 250.0 | 0.006 |
| 249.0 | 0.006 |
| 248.0 | 0.005 |
| 247.0 | 0.002 |
| 246.0 | 0.002 |
| 245.0 | 0.006 |
| 244.0 | 0.005 |
| 243.0 | 0.001 |
| 242.0 | 0.005 |
| 241.0 | 0.002 |
| 240.0 | 0.001 |
| 239.0 | 0.006 |
| 238.0 | 0.006 |
| 237.0 | 0.006 |
| 236.0 | 0.004 |
| 235.0 | 0.001 |
| 234.0 | 0.002 |
| 233.0 | 0.007 |
| 232.0 | 0.005 |
| 231.0 | 0.002 |
| 230.0 | 0.006 |
| 229.0 | 0.002 |
| 228.0 | 0.003 |
| 227.0 | 0.005 |
| 226.0 | 0.007 |
| 225.0 | 0.004 |
| 224.0 | 0.006 |
| 223.0 | 0.002 |
| 222.0 | 0.003 |
| 221.0 | 0.005 |
| 220.0 | 0.007 |
| 219.0 | 0.003 |
| 218.0 | 0.006 |
| 217.0 | 0.002 |
| 216.0 | 0.004 |
| 215.0 | 0.006 |
| 214.0 | 0.008 |
| 213.0 | 0.003 |
| 212.0 | 0.006 |
| 211.0 | 0.002 |
| 210.0 | 0.004 |
| 209.0 | 0.006 |
| 208.0 | 0.008 |
| 207.0 | 0.006 |
| 206.0 | 0.007 |
| 205.0 | 0.004 |
| 204.0 | 0.005 |
| 203.0 | 0.008 |
| 202.0 | 0.01 |
| 201.0 | 0.011 |